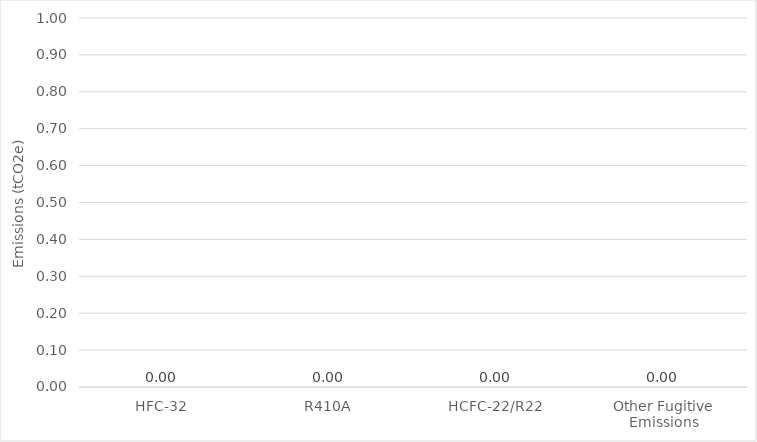
| Category | Emissions
(tCO2e) |
|---|---|
| HFC-32 | 0 |
| R410A | 0 |
| HCFC-22/R22 | 0 |
| Other Fugitive Emissions | 0 |